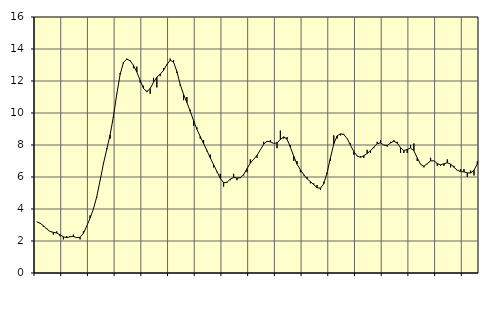
| Category | Piggar | Series 1 |
|---|---|---|
| nan | 3.2 | 3.2 |
| 87.0 | 3.1 | 3.12 |
| 87.0 | 2.9 | 2.96 |
| 87.0 | 2.8 | 2.75 |
| nan | 2.6 | 2.6 |
| 88.0 | 2.4 | 2.54 |
| 88.0 | 2.6 | 2.5 |
| 88.0 | 2.3 | 2.39 |
| nan | 2.1 | 2.26 |
| 89.0 | 2.3 | 2.21 |
| 89.0 | 2.3 | 2.27 |
| 89.0 | 2.4 | 2.28 |
| nan | 2.2 | 2.21 |
| 90.0 | 2.1 | 2.23 |
| 90.0 | 2.6 | 2.48 |
| 90.0 | 2.9 | 2.93 |
| nan | 3.6 | 3.43 |
| 91.0 | 4 | 4 |
| 91.0 | 4.7 | 4.77 |
| 91.0 | 5.8 | 5.78 |
| nan | 6.9 | 6.83 |
| 92.0 | 7.8 | 7.73 |
| 92.0 | 8.4 | 8.64 |
| 92.0 | 9.7 | 9.79 |
| nan | 11.2 | 11.18 |
| 93.0 | 12.5 | 12.41 |
| 93.0 | 13.1 | 13.16 |
| 93.0 | 13.4 | 13.37 |
| nan | 13.3 | 13.26 |
| 94.0 | 12.8 | 12.98 |
| 94.0 | 12.9 | 12.56 |
| 94.0 | 11.9 | 12.04 |
| nan | 11.7 | 11.54 |
| 95.0 | 11.4 | 11.33 |
| 95.0 | 11.2 | 11.53 |
| 95.0 | 12.2 | 11.92 |
| nan | 11.6 | 12.24 |
| 96.0 | 12.3 | 12.43 |
| 96.0 | 12.8 | 12.66 |
| 96.0 | 13 | 13.03 |
| nan | 13.4 | 13.29 |
| 97.0 | 13.3 | 13.19 |
| 97.0 | 12.5 | 12.59 |
| 97.0 | 11.7 | 11.79 |
| nan | 10.8 | 11.16 |
| 98.0 | 11 | 10.66 |
| 98.0 | 10.2 | 10.11 |
| 98.0 | 9.2 | 9.53 |
| nan | 9.1 | 8.98 |
| 99.0 | 8.4 | 8.53 |
| 99.0 | 8.3 | 8.09 |
| 99.0 | 7.6 | 7.65 |
| nan | 7.4 | 7.2 |
| 0.0 | 6.6 | 6.77 |
| 0.0 | 6.3 | 6.34 |
| 0.0 | 6.2 | 5.92 |
| nan | 5.4 | 5.64 |
| 1.0 | 5.7 | 5.66 |
| 1.0 | 5.8 | 5.87 |
| 1.0 | 6.2 | 5.97 |
| nan | 5.8 | 5.94 |
| 2.0 | 6 | 5.95 |
| 2.0 | 6.1 | 6.15 |
| 2.0 | 6.3 | 6.52 |
| nan | 7.1 | 6.87 |
| 3.0 | 7.1 | 7.11 |
| 3.0 | 7.2 | 7.35 |
| 3.0 | 7.7 | 7.7 |
| nan | 8.2 | 8.05 |
| 4.0 | 8.2 | 8.23 |
| 4.0 | 8.3 | 8.2 |
| 4.0 | 8.1 | 8.1 |
| nan | 7.8 | 8.14 |
| 5.0 | 8.9 | 8.34 |
| 5.0 | 8.4 | 8.51 |
| 5.0 | 8.5 | 8.36 |
| nan | 8 | 7.87 |
| 6.0 | 7 | 7.3 |
| 6.0 | 7 | 6.8 |
| 6.0 | 6.3 | 6.45 |
| nan | 6.1 | 6.15 |
| 7.0 | 6 | 5.89 |
| 7.0 | 5.6 | 5.71 |
| 7.0 | 5.6 | 5.52 |
| nan | 5.5 | 5.33 |
| 8.0 | 5.2 | 5.3 |
| 8.0 | 5.7 | 5.58 |
| 8.0 | 6.2 | 6.27 |
| nan | 7 | 7.2 |
| 9.0 | 8.6 | 8.07 |
| 9.0 | 8.4 | 8.57 |
| 9.0 | 8.6 | 8.7 |
| nan | 8.7 | 8.65 |
| 10.0 | 8.4 | 8.41 |
| 10.0 | 8.1 | 7.99 |
| 10.0 | 7.4 | 7.59 |
| nan | 7.3 | 7.31 |
| 11.0 | 7.3 | 7.23 |
| 11.0 | 7.2 | 7.33 |
| 11.0 | 7.7 | 7.47 |
| nan | 7.5 | 7.64 |
| 12.0 | 7.8 | 7.87 |
| 12.0 | 8.2 | 8.08 |
| 12.0 | 8.3 | 8.13 |
| nan | 8 | 8 |
| 13.0 | 7.9 | 7.97 |
| 13.0 | 8.2 | 8.13 |
| 13.0 | 8.3 | 8.24 |
| nan | 8.2 | 8.12 |
| 14.0 | 7.5 | 7.83 |
| 14.0 | 7.5 | 7.65 |
| 14.0 | 7.5 | 7.72 |
| nan | 8 | 7.81 |
| 15.0 | 8.1 | 7.64 |
| 15.0 | 7 | 7.2 |
| 15.0 | 6.8 | 6.79 |
| nan | 6.6 | 6.67 |
| 16.0 | 6.8 | 6.83 |
| 16.0 | 7.2 | 7.01 |
| 16.0 | 7 | 7.01 |
| nan | 6.7 | 6.84 |
| 17.0 | 6.7 | 6.76 |
| 17.0 | 6.7 | 6.83 |
| 17.0 | 7.1 | 6.89 |
| nan | 6.6 | 6.8 |
| 18.0 | 6.7 | 6.61 |
| 18.0 | 6.4 | 6.42 |
| 18.0 | 6.5 | 6.34 |
| nan | 6.5 | 6.32 |
| 19.0 | 6 | 6.26 |
| 19.0 | 6.4 | 6.25 |
| 19.0 | 6.1 | 6.43 |
| nan | 7 | 6.81 |